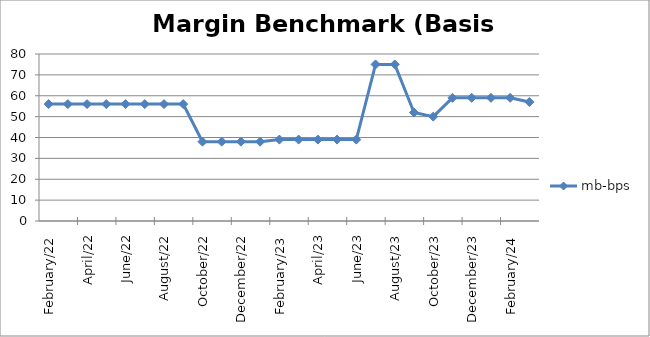
| Category | mb-bps |
|---|---|
| 2022-02-15 | 56 |
| 2022-03-15 | 56 |
| 2022-04-15 | 56 |
| 2022-05-15 | 56 |
| 2022-06-15 | 56 |
| 2022-07-15 | 56 |
| 2022-08-15 | 56 |
| 2022-09-15 | 56 |
| 2022-10-15 | 38 |
| 2022-11-15 | 38 |
| 2022-12-15 | 38 |
| 2023-01-15 | 38 |
| 2023-02-15 | 39 |
| 2023-03-15 | 39 |
| 2023-04-15 | 39 |
| 2023-05-15 | 39 |
| 2023-06-15 | 39 |
| 2023-07-15 | 75 |
| 2023-08-15 | 75 |
| 2023-09-15 | 52 |
| 2023-10-15 | 50 |
| 2023-11-15 | 59 |
| 2023-12-15 | 59 |
| 2024-01-15 | 59 |
| 2024-02-15 | 59 |
| 2024-03-15 | 57 |